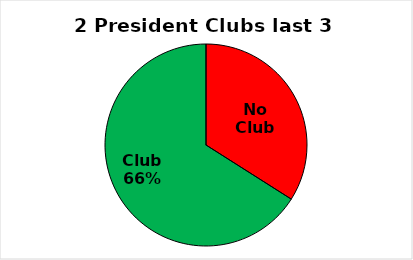
| Category | Series 0 |
|---|---|
| No Club | 0.34 |
| Club | 0.66 |